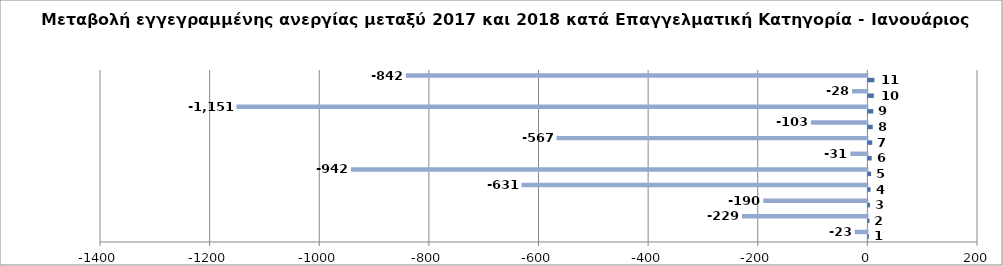
| Category | Series 0 | Series 1 |
|---|---|---|
| 0 | 1 | -23 |
| 1 | 2 | -229 |
| 2 | 3 | -190 |
| 3 | 4 | -631 |
| 4 | 5 | -942 |
| 5 | 6 | -31 |
| 6 | 7 | -567 |
| 7 | 8 | -103 |
| 8 | 9 | -1151 |
| 9 | 10 | -28 |
| 10 | 11 | -842 |